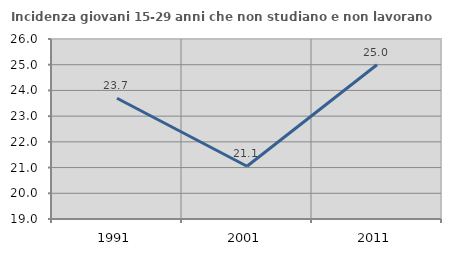
| Category | Incidenza giovani 15-29 anni che non studiano e non lavorano  |
|---|---|
| 1991.0 | 23.694 |
| 2001.0 | 21.053 |
| 2011.0 | 25 |